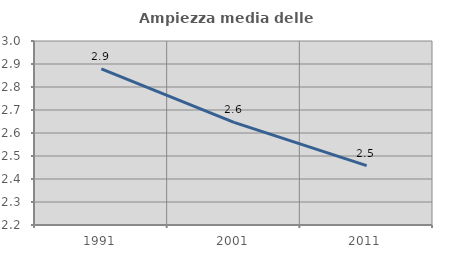
| Category | Ampiezza media delle famiglie |
|---|---|
| 1991.0 | 2.879 |
| 2001.0 | 2.646 |
| 2011.0 | 2.458 |